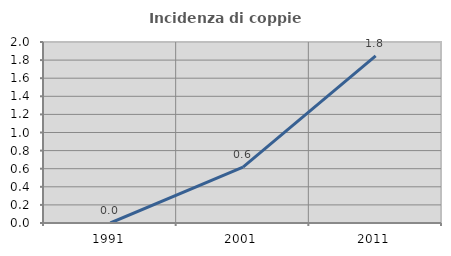
| Category | Incidenza di coppie miste |
|---|---|
| 1991.0 | 0 |
| 2001.0 | 0.618 |
| 2011.0 | 1.847 |